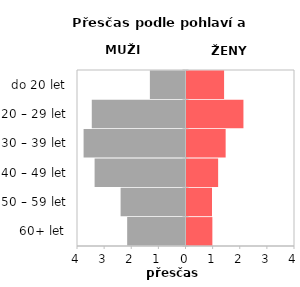
| Category | Přesčas |
|---|---|
| 60+ let | 0.954 |
| 50 – 59 let | 0.94 |
| 40 – 49 let | 1.166 |
| 30 – 39 let | 1.443 |
| 20 – 29 let | 2.099 |
| do 20 let | 1.386 |